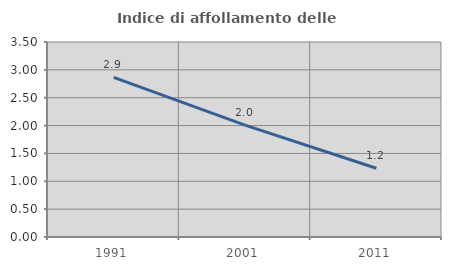
| Category | Indice di affollamento delle abitazioni  |
|---|---|
| 1991.0 | 2.865 |
| 2001.0 | 2.008 |
| 2011.0 | 1.234 |